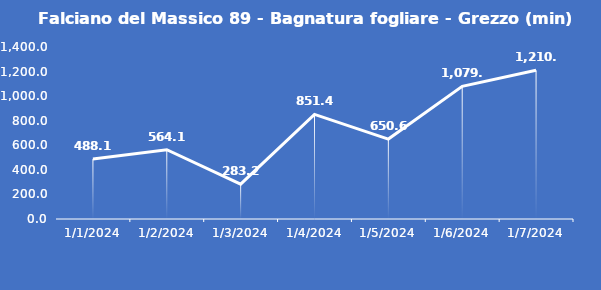
| Category | Falciano del Massico 89 - Bagnatura fogliare - Grezzo (min) |
|---|---|
| 1/1/24 | 488.1 |
| 1/2/24 | 564.1 |
| 1/3/24 | 283.2 |
| 1/4/24 | 851.4 |
| 1/5/24 | 650.6 |
| 1/6/24 | 1079.8 |
| 1/7/24 | 1210.5 |